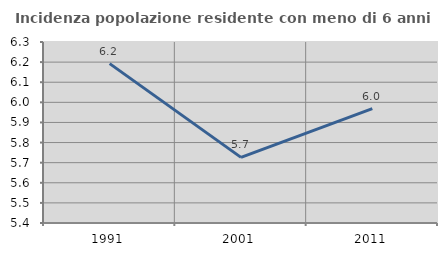
| Category | Incidenza popolazione residente con meno di 6 anni |
|---|---|
| 1991.0 | 6.192 |
| 2001.0 | 5.726 |
| 2011.0 | 5.969 |